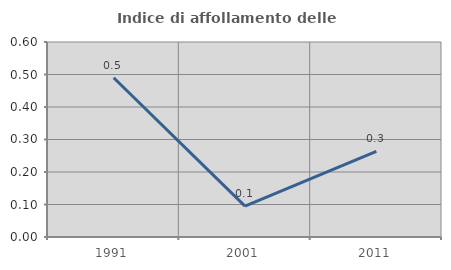
| Category | Indice di affollamento delle abitazioni  |
|---|---|
| 1991.0 | 0.49 |
| 2001.0 | 0.095 |
| 2011.0 | 0.263 |